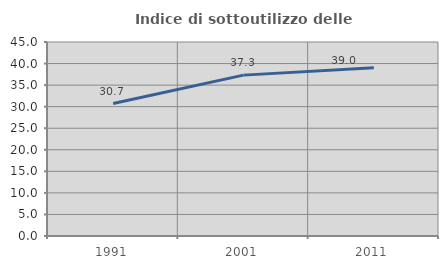
| Category | Indice di sottoutilizzo delle abitazioni  |
|---|---|
| 1991.0 | 30.726 |
| 2001.0 | 37.317 |
| 2011.0 | 39.02 |